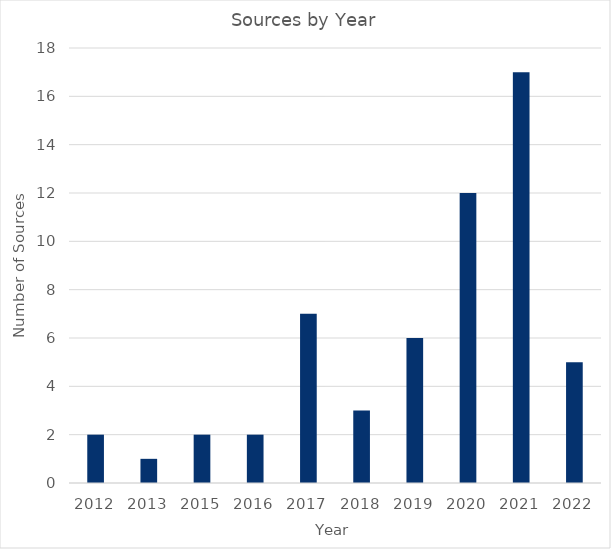
| Category | Total |
|---|---|
| 2012 | 2 |
| 2013 | 1 |
| 2015 | 2 |
| 2016 | 2 |
| 2017 | 7 |
| 2018 | 3 |
| 2019 | 6 |
| 2020 | 12 |
| 2021 | 17 |
| 2022 | 5 |